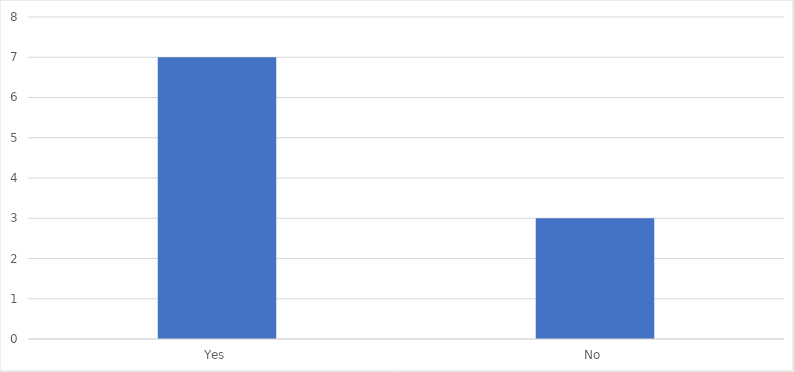
| Category | Number of Responses |
|---|---|
| Yes | 7 |
| No | 3 |